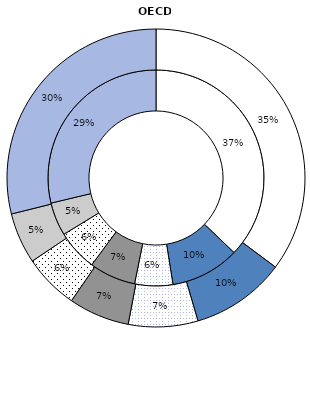
| Category | 2006 | Series 1 |
|---|---|---|
| United States | 37469 | 43738.901 |
| Germany | 10431 | 12738 |
| United Kingdom | 5757 | 9369 |
| France | 7017.207 | 8210.1 |
| Canada | 6186.95 | 7433.4 |
| Australia | 5031.63 | 6873.05 |
| Other countries | 28991.492 | 35883.95 |